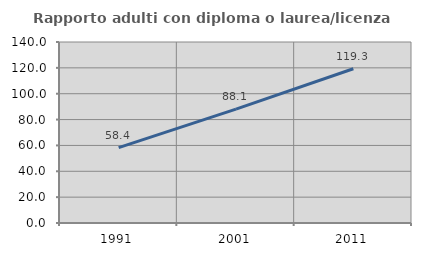
| Category | Rapporto adulti con diploma o laurea/licenza media  |
|---|---|
| 1991.0 | 58.357 |
| 2001.0 | 88.13 |
| 2011.0 | 119.328 |